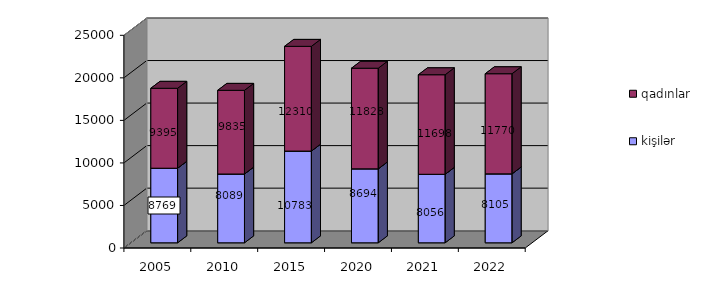
| Category | kişilər | qadınlar |
|---|---|---|
| 2005.0 | 8769 | 9395 |
| 2010.0 | 8089 | 9835 |
| 2015.0 | 10783 | 12310 |
| 2020.0 | 8694 | 11828 |
| 2021.0 | 8056 | 11698 |
| 2022.0 | 8105 | 11770 |